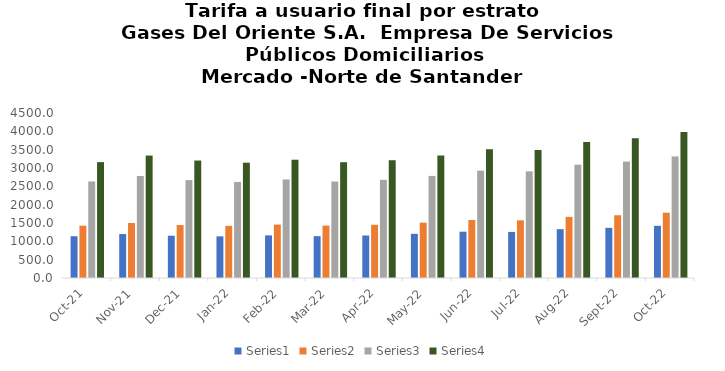
| Category | Series 0 | Series 1 | Series 2 | Series 3 |
|---|---|---|---|---|
| 2021-10-01 | 1140.1 | 1427.25 | 2633.54 | 3160.248 |
| 2021-11-01 | 1198.31 | 1499.77 | 2782.74 | 3339.288 |
| 2021-12-01 | 1152.94 | 1444.18 | 2669.52 | 3203.424 |
| 2022-01-01 | 1135.52 | 1421.55 | 2620.4 | 3144.48 |
| 2022-02-01 | 1162.74 | 1456.54 | 2688.25 | 3225.9 |
| 2022-03-01 | 1141.46 | 1427.8 | 2631.42 | 3157.704 |
| 2022-04-01 | 1158.72 | 1451.12 | 2676.82 | 3212.184 |
| 2022-05-01 | 1204.73 | 1510.34 | 2784.06 | 3340.872 |
| 2022-06-01 | 1262.94 | 1581.51 | 2927.04 | 3512.448 |
| 2022-07-01 | 1256.88 | 1573.21 | 2908.56 | 3490.272 |
| 2022-08-01 | 1331.73 | 1667.06 | 3090.43 | 3708.516 |
| 2022-09-01 | 1367.51 | 1711.63 | 3176.14 | 3811.368 |
| 2022-10-01 | 1423.49 | 1781.6 | 3315.35 | 3978.42 |